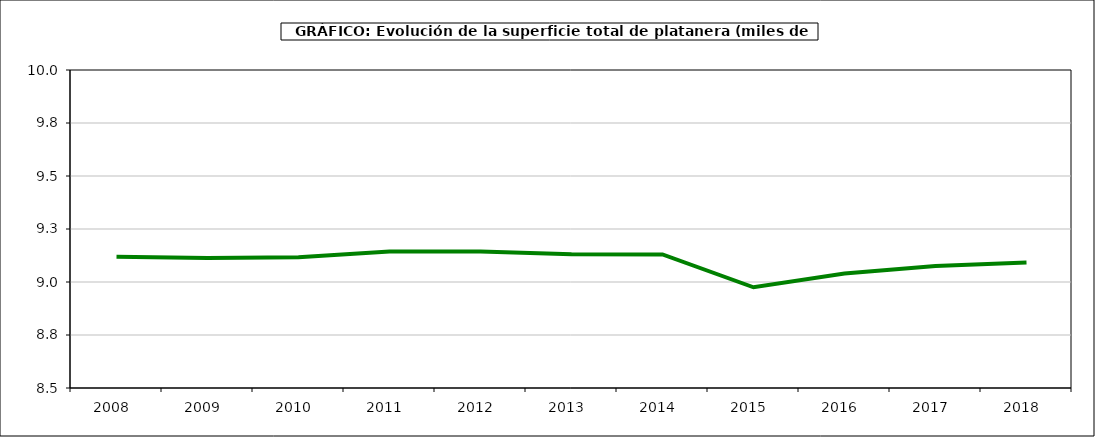
| Category | superficie platanera |
|---|---|
| 2008.0 | 9.119 |
| 2009.0 | 9.113 |
| 2010.0 | 9.117 |
| 2011.0 | 9.144 |
| 2012.0 | 9.144 |
| 2013.0 | 9.131 |
| 2014.0 | 9.13 |
| 2015.0 | 8.975 |
| 2016.0 | 9.04 |
| 2017.0 | 9.076 |
| 2018.0 | 9.092 |